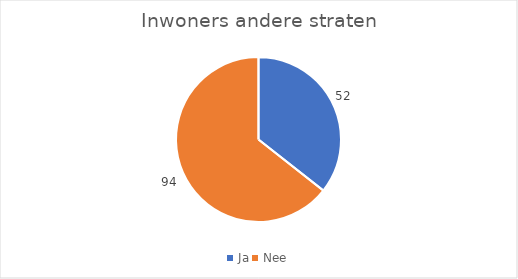
| Category | Series 0 |
|---|---|
| Ja | 52 |
| Nee | 94 |